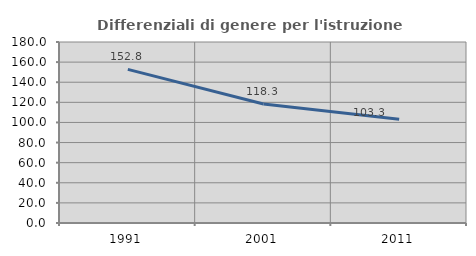
| Category | Differenziali di genere per l'istruzione superiore |
|---|---|
| 1991.0 | 152.804 |
| 2001.0 | 118.272 |
| 2011.0 | 103.285 |